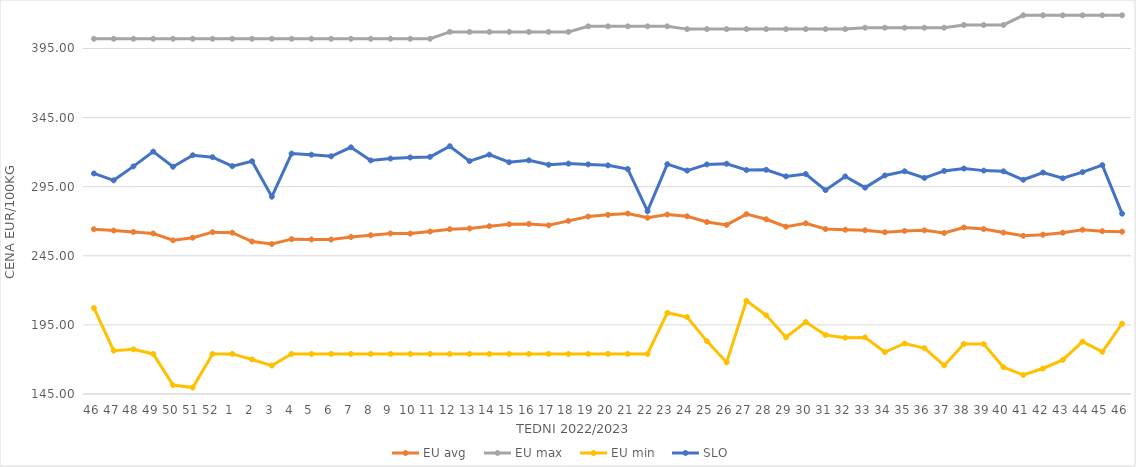
| Category | EU avg | EU max | EU min | SLO |
|---|---|---|---|---|
| 46.0 | 264.228 | 402 | 207.247 | 304.58 |
| 47.0 | 263.24 | 402 | 176.378 | 299.59 |
| 48.0 | 262.225 | 402 | 177.332 | 309.69 |
| 49.0 | 261.152 | 402 | 174 | 320.38 |
| 50.0 | 256.24 | 402 | 151.434 | 309.44 |
| 51.0 | 258.071 | 402 | 149.638 | 317.74 |
| 52.0 | 262.088 | 402 | 174 | 316.36 |
| 1.0 | 261.716 | 402 | 174 | 309.84 |
| 2.0 | 255.331 | 402 | 169.983 | 313.4 |
| 3.0 | 253.546 | 402 | 165.574 | 287.81 |
| 4.0 | 257.051 | 402 | 174 | 318.98 |
| 5.0 | 256.808 | 402 | 174 | 318.13 |
| 6.0 | 256.75 | 402 | 174 | 316.99 |
| 7.0 | 258.565 | 402 | 174 | 323.47 |
| 8.0 | 259.872 | 402 | 174 | 314 |
| 9.0 | 261.164 | 402 | 174 | 315.35 |
| 10.0 | 261.06 | 402 | 174 | 316.13 |
| 11.0 | 262.513 | 402 | 174 | 316.55 |
| 12.0 | 264.228 | 407 | 174 | 324.27 |
| 13.0 | 264.768 | 407 | 174 | 313.49 |
| 14.0 | 266.385 | 407 | 174 | 318.17 |
| 15.0 | 267.797 | 407 | 174 | 312.7 |
| 16.0 | 268.021 | 407 | 174 | 314.07 |
| 17.0 | 267.041 | 407 | 174 | 310.87 |
| 18.0 | 270.255 | 407 | 174 | 311.69 |
| 19.0 | 273.406 | 411 | 174 | 311.13 |
| 20.0 | 274.631 | 411 | 174 | 310.42 |
| 21.0 | 275.561 | 411 | 174 | 307.76 |
| 22.0 | 272.542 | 411 | 174 | 277.34 |
| 23.0 | 274.85 | 411 | 203.728 | 311.28 |
| 24.0 | 273.59 | 409 | 200.686 | 306.64 |
| 25.0 | 269.439 | 409 | 183.275 | 311.1 |
| 26.0 | 267.345 | 409 | 167.858 | 311.62 |
| 27.0 | 275.123 | 409 | 212.506 | 307.04 |
| 28.0 | 271.42 | 409 | 201.945 | 307.23 |
| 29.0 | 266.08 | 409 | 186.018 | 302.45 |
| 30.0 | 268.49 | 409 | 197.093 | 304.14 |
| 31.0 | 264.334 | 409 | 187.684 | 292.49 |
| 32.0 | 263.844 | 409 | 185.774 | 302.41 |
| 33.0 | 263.441 | 410 | 185.951 | 294.3 |
| 34.0 | 262.028 | 410 | 175.332 | 303.1 |
| 35.0 | 262.997 | 410 | 181.543 | 306.13 |
| 36.0 | 263.389 | 410 | 178.207 | 301.32 |
| 37.0 | 261.486 | 410 | 165.697 | 306.4 |
| 38.0 | 265.47 | 412 | 181.159 | 308.12 |
| 39.0 | 264.316 | 412 | 181.124 | 306.62 |
| 40.0 | 261.789 | 412 | 164.37 | 306.1 |
| 41.0 | 259.491 | 419 | 158.728 | 300 |
| 42.0 | 260.236 | 419 | 163.464 | 305.24 |
| 43.0 | 261.681 | 419 | 169.66 | 301.07 |
| 44.0 | 263.839 | 419 | 182.925 | 305.52 |
| 45.0 | 262.815 | 419 | 175.524 | 310.58 |
| 46.0 | 262.461 | 419 | 195.869 | 275.46 |